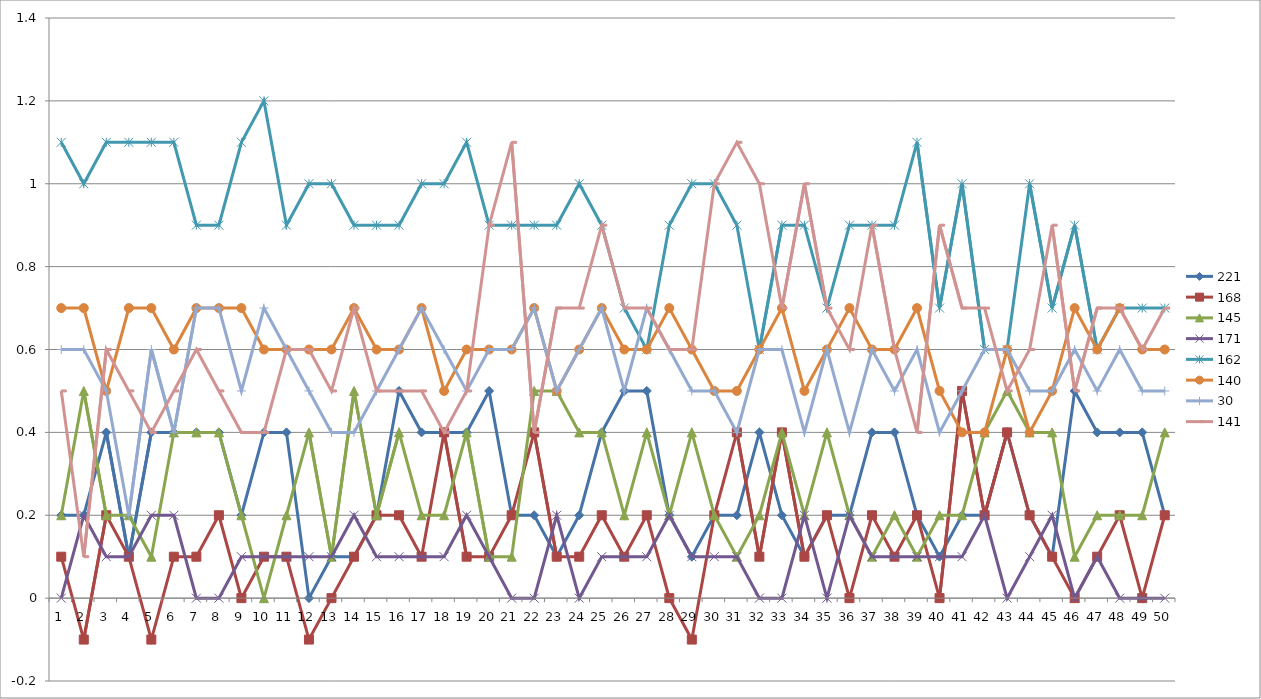
| Category | 221 | 168 | 145 | 171 | 162 | 140 | 30 | 141 |
|---|---|---|---|---|---|---|---|---|
| 0 | 0.2 | 0.1 | 0.2 | 0 | 1.1 | 0.7 | 0.6 | 0.5 |
| 1 | 0.2 | -0.1 | 0.5 | 0.2 | 1 | 0.7 | 0.6 | 0.1 |
| 2 | 0.4 | 0.2 | 0.2 | 0.1 | 1.1 | 0.5 | 0.5 | 0.6 |
| 3 | 0.1 | 0.1 | 0.2 | 0.1 | 1.1 | 0.7 | 0.2 | 0.5 |
| 4 | 0.4 | -0.1 | 0.1 | 0.2 | 1.1 | 0.7 | 0.6 | 0.4 |
| 5 | 0.4 | 0.1 | 0.4 | 0.2 | 1.1 | 0.6 | 0.4 | 0.5 |
| 6 | 0.4 | 0.1 | 0.4 | 0 | 0.9 | 0.7 | 0.7 | 0.6 |
| 7 | 0.4 | 0.2 | 0.4 | 0 | 0.9 | 0.7 | 0.7 | 0.5 |
| 8 | 0.2 | 0 | 0.2 | 0.1 | 1.1 | 0.7 | 0.5 | 0.4 |
| 9 | 0.4 | 0.1 | 0 | 0.1 | 1.2 | 0.6 | 0.7 | 0.4 |
| 10 | 0.4 | 0.1 | 0.2 | 0.1 | 0.9 | 0.6 | 0.6 | 0.6 |
| 11 | 0 | -0.1 | 0.4 | 0.1 | 1 | 0.6 | 0.5 | 0.6 |
| 12 | 0.1 | 0 | 0.1 | 0.1 | 1 | 0.6 | 0.4 | 0.5 |
| 13 | 0.1 | 0.1 | 0.5 | 0.2 | 0.9 | 0.7 | 0.4 | 0.7 |
| 14 | 0.2 | 0.2 | 0.2 | 0.1 | 0.9 | 0.6 | 0.5 | 0.5 |
| 15 | 0.5 | 0.2 | 0.4 | 0.1 | 0.9 | 0.6 | 0.6 | 0.5 |
| 16 | 0.4 | 0.1 | 0.2 | 0.1 | 1 | 0.7 | 0.7 | 0.5 |
| 17 | 0.4 | 0.4 | 0.2 | 0.1 | 1 | 0.5 | 0.6 | 0.4 |
| 18 | 0.4 | 0.1 | 0.4 | 0.2 | 1.1 | 0.6 | 0.5 | 0.5 |
| 19 | 0.5 | 0.1 | 0.1 | 0.1 | 0.9 | 0.6 | 0.6 | 0.9 |
| 20 | 0.2 | 0.2 | 0.1 | 0 | 0.9 | 0.6 | 0.6 | 1.1 |
| 21 | 0.2 | 0.4 | 0.5 | 0 | 0.9 | 0.7 | 0.7 | 0.4 |
| 22 | 0.1 | 0.1 | 0.5 | 0.2 | 0.9 | 0.5 | 0.5 | 0.7 |
| 23 | 0.2 | 0.1 | 0.4 | 0 | 1 | 0.6 | 0.6 | 0.7 |
| 24 | 0.4 | 0.2 | 0.4 | 0.1 | 0.9 | 0.7 | 0.7 | 0.9 |
| 25 | 0.5 | 0.1 | 0.2 | 0.1 | 0.7 | 0.6 | 0.5 | 0.7 |
| 26 | 0.5 | 0.2 | 0.4 | 0.1 | 0.6 | 0.6 | 0.7 | 0.7 |
| 27 | 0.2 | 0 | 0.2 | 0.2 | 0.9 | 0.7 | 0.6 | 0.6 |
| 28 | 0.1 | -0.1 | 0.4 | 0.1 | 1 | 0.6 | 0.5 | 0.6 |
| 29 | 0.2 | 0.2 | 0.2 | 0.1 | 1 | 0.5 | 0.5 | 1 |
| 30 | 0.2 | 0.4 | 0.1 | 0.1 | 0.9 | 0.5 | 0.4 | 1.1 |
| 31 | 0.4 | 0.1 | 0.2 | 0 | 0.6 | 0.6 | 0.6 | 1 |
| 32 | 0.2 | 0.4 | 0.4 | 0 | 0.9 | 0.7 | 0.6 | 0.7 |
| 33 | 0.1 | 0.1 | 0.2 | 0.2 | 0.9 | 0.5 | 0.4 | 1 |
| 34 | 0.2 | 0.2 | 0.4 | 0 | 0.7 | 0.6 | 0.6 | 0.7 |
| 35 | 0.2 | 0 | 0.2 | 0.2 | 0.9 | 0.7 | 0.4 | 0.6 |
| 36 | 0.4 | 0.2 | 0.1 | 0.1 | 0.9 | 0.6 | 0.6 | 0.9 |
| 37 | 0.4 | 0.1 | 0.2 | 0.1 | 0.9 | 0.6 | 0.5 | 0.6 |
| 38 | 0.2 | 0.2 | 0.1 | 0.1 | 1.1 | 0.7 | 0.6 | 0.4 |
| 39 | 0.1 | 0 | 0.2 | 0.1 | 0.7 | 0.5 | 0.4 | 0.9 |
| 40 | 0.2 | 0.5 | 0.2 | 0.1 | 1 | 0.4 | 0.5 | 0.7 |
| 41 | 0.2 | 0.2 | 0.4 | 0.2 | 0.6 | 0.4 | 0.6 | 0.7 |
| 42 | 0.4 | 0.4 | 0.5 | 0 | 0.6 | 0.6 | 0.6 | 0.5 |
| 43 | 0.2 | 0.2 | 0.4 | 0.1 | 1 | 0.4 | 0.5 | 0.6 |
| 44 | 0.1 | 0.1 | 0.4 | 0.2 | 0.7 | 0.5 | 0.5 | 0.9 |
| 45 | 0.5 | 0 | 0.1 | 0 | 0.9 | 0.7 | 0.6 | 0.5 |
| 46 | 0.4 | 0.1 | 0.2 | 0.1 | 0.6 | 0.6 | 0.5 | 0.7 |
| 47 | 0.4 | 0.2 | 0.2 | 0 | 0.7 | 0.7 | 0.6 | 0.7 |
| 48 | 0.4 | 0 | 0.2 | 0 | 0.7 | 0.6 | 0.5 | 0.6 |
| 49 | 0.2 | 0.2 | 0.4 | 0 | 0.7 | 0.6 | 0.5 | 0.7 |